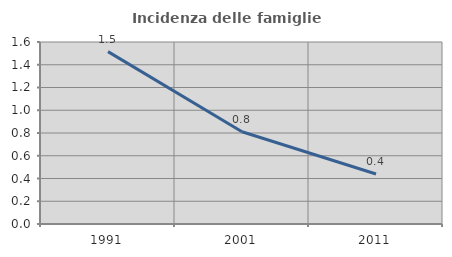
| Category | Incidenza delle famiglie numerose |
|---|---|
| 1991.0 | 1.515 |
| 2001.0 | 0.811 |
| 2011.0 | 0.44 |